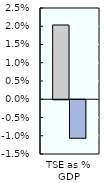
| Category | 2000-02 | 2018-20 |
|---|---|---|
| TSE as % GDP | 0.02 | -0.011 |